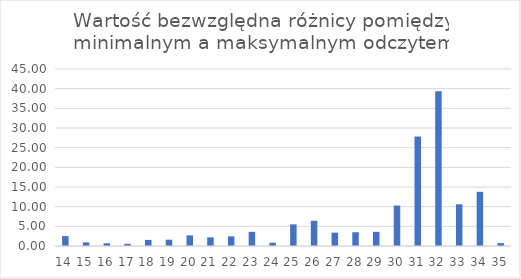
| Category | Wartość bezwzględna różnicy pomiędzy minimalnym a maksymalnym odczytem |
|---|---|
| 14.0 | 2.52 |
| 15.0 | 0.915 |
| 16.0 | 0.7 |
| 17.0 | 0.555 |
| 18.0 | 1.55 |
| 19.0 | 1.6 |
| 20.0 | 2.7 |
| 21.0 | 2.2 |
| 22.0 | 2.45 |
| 23.0 | 3.6 |
| 24.0 | 0.84 |
| 25.0 | 5.5 |
| 26.0 | 6.418 |
| 27.0 | 3.39 |
| 28.0 | 3.5 |
| 29.0 | 3.6 |
| 30.0 | 10.294 |
| 31.0 | 27.825 |
| 32.0 | 39.329 |
| 33.0 | 10.6 |
| 34.0 | 13.776 |
| 35.0 | 0.74 |